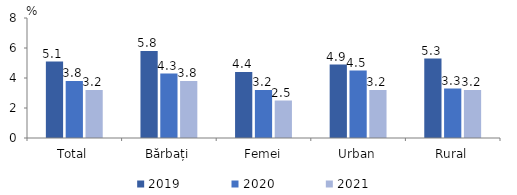
| Category | 2019 | 2020 | 2021 |
|---|---|---|---|
| Total | 5.1 | 3.8 | 3.2 |
| Bărbați | 5.8 | 4.3 | 3.8 |
| Femei | 4.4 | 3.2 | 2.5 |
| Urban | 4.9 | 4.5 | 3.2 |
| Rural | 5.3 | 3.3 | 3.2 |